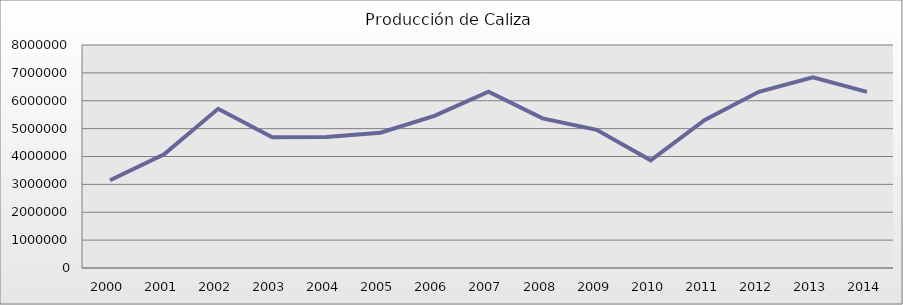
| Category | Series 0 |
|---|---|
| 2000.0 | 3147014.95 |
| 2001.0 | 4078786.53 |
| 2002.0 | 5711782.27 |
| 2003.0 | 4688013 |
| 2004.0 | 4699987.59 |
| 2005.0 | 4854958.36 |
| 2006.0 | 5456546.18 |
| 2007.0 | 6326616.42 |
| 2008.0 | 5366498.39 |
| 2009.0 | 4956671.94 |
| 2010.0 | 3862307.61 |
| 2011.0 | 5309485.09 |
| 2012.0 | 6319428.21 |
| 2013.0 | 6838391.04 |
| 2014.0 | 6319428.21 |